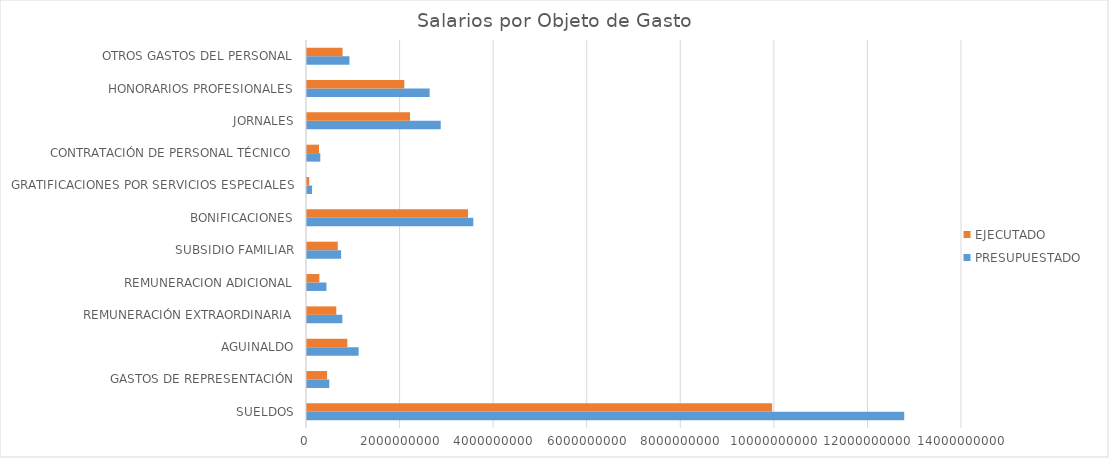
| Category | PRESUPUESTADO | EJECUTADO |
|---|---|---|
| SUELDOS | 12764926056 | 9941706476 |
| GASTOS DE REPRESENTACIÓN | 476214000 | 429167197 |
| AGUINALDO | 1103428338 | 861432411 |
| REMUNERACIÓN EXTRAORDINARIA | 755333416 | 625956985 |
| REMUNERACION ADICIONAL | 415863008 | 264721131 |
| SUBSIDIO FAMILIAR | 728300000 | 657678692 |
| BONIFICACIONES | 3554010080 | 3440803632 |
| GRATIFICACIONES POR SERVICIOS ESPECIALES | 108000000 | 46800000 |
| CONTRATACIÓN DE PERSONAL TÉCNICO | 284075000 | 256150299 |
| JORNALES | 2858157615 | 2202360656 |
| HONORARIOS PROFESIONALES | 2621469520 | 2079606497 |
| OTROS GASTOS DEL PERSONAL | 907314364 | 759852847 |